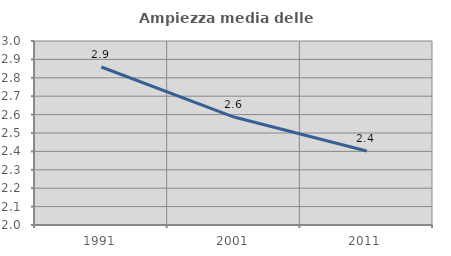
| Category | Ampiezza media delle famiglie |
|---|---|
| 1991.0 | 2.859 |
| 2001.0 | 2.587 |
| 2011.0 | 2.402 |